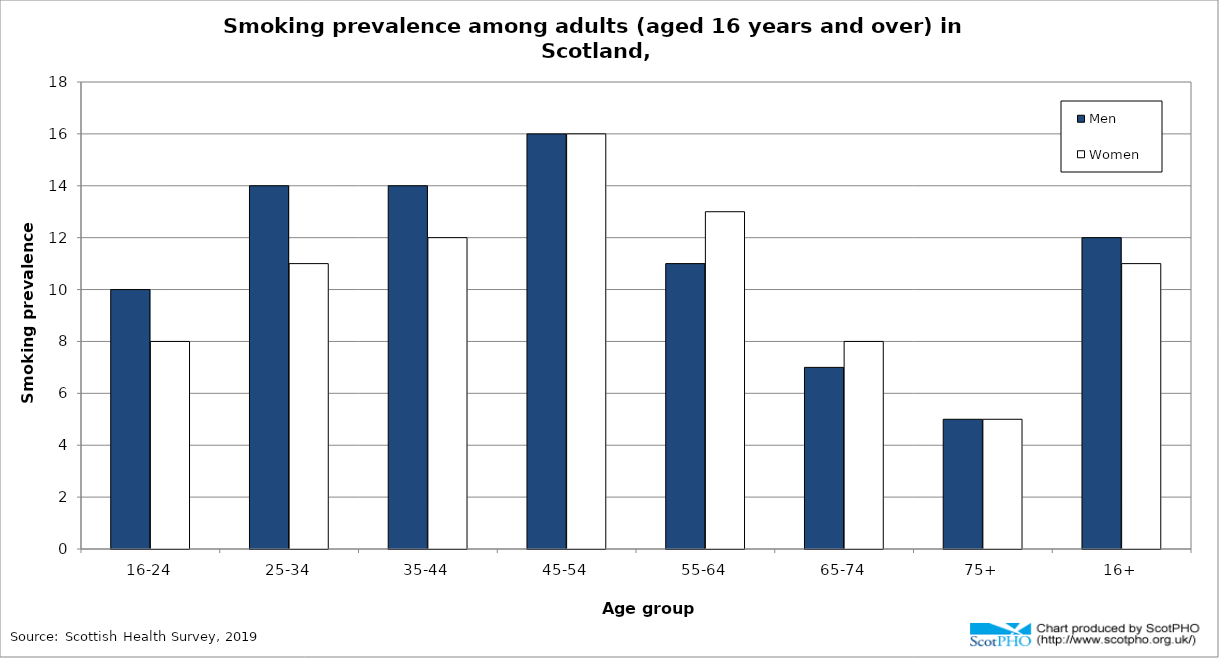
| Category | Men | Women |
|---|---|---|
| 16-24 | 10 | 8 |
| 25-34 | 14 | 11 |
| 35-44 | 14 | 12 |
| 45-54 | 16 | 16 |
| 55-64 | 11 | 13 |
| 65-74 | 7 | 8 |
| 75+ | 5 | 5 |
| 16+ | 12 | 11 |